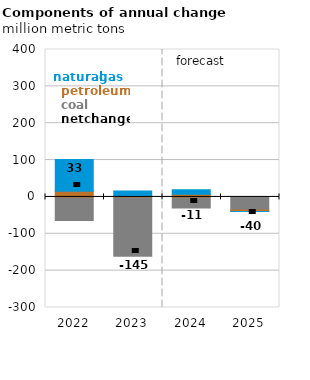
| Category | Coal | Petroleum | Natural gas |
|---|---|---|---|
| 2022.0 | -64.001 | 15.434 | 86.024 |
| 2023.0 | -161.004 | 2.761 | 13.66 |
| 2024.0 | -30.19 | 7.459 | 11.805 |
| 2025.0 | -35.577 | -3.769 | -0.514 |